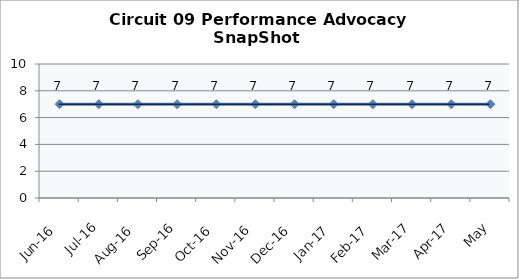
| Category | Circuit 09 |
|---|---|
| Jun-16 | 7 |
| Jul-16 | 7 |
| Aug-16 | 7 |
| Sep-16 | 7 |
| Oct-16 | 7 |
| Nov-16 | 7 |
| Dec-16 | 7 |
| Jan-17 | 7 |
| Feb-17 | 7 |
| Mar-17 | 7 |
| Apr-17 | 7 |
| May | 7 |